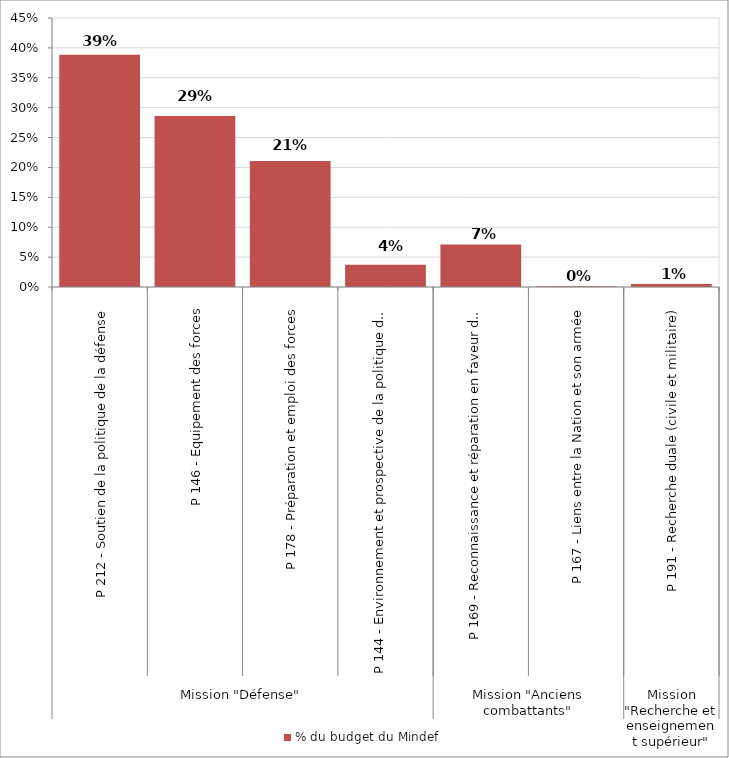
| Category | % du budget du Mindef |
|---|---|
| 0 | 0.388 |
| 1 | 0.286 |
| 2 | 0.211 |
| 3 | 0.037 |
| 4 | 0.071 |
| 5 | 0.001 |
| 6 | 0.005 |